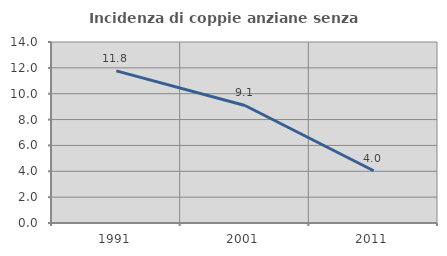
| Category | Incidenza di coppie anziane senza figli  |
|---|---|
| 1991.0 | 11.765 |
| 2001.0 | 9.091 |
| 2011.0 | 4.04 |